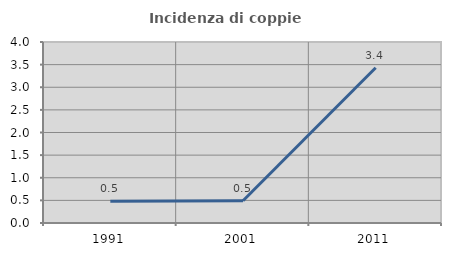
| Category | Incidenza di coppie miste |
|---|---|
| 1991.0 | 0.483 |
| 2001.0 | 0.493 |
| 2011.0 | 3.431 |